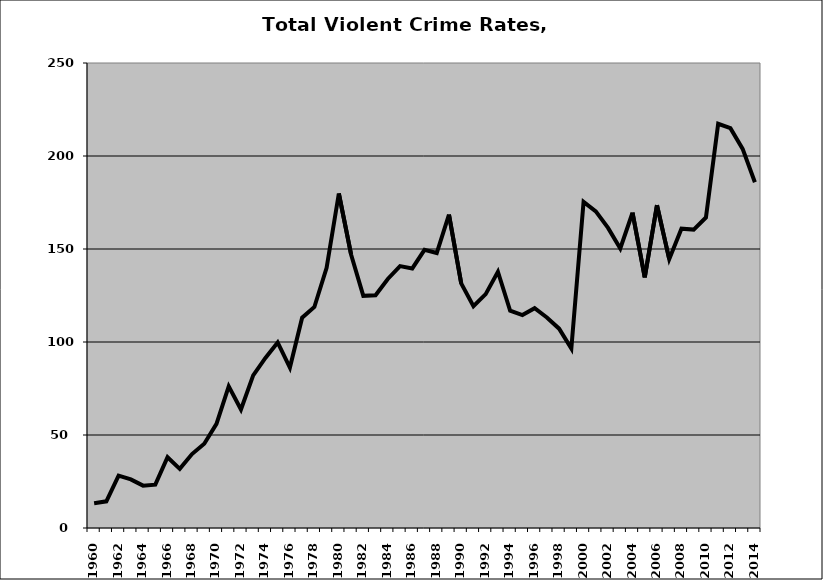
| Category | VCR |
|---|---|
| 1960.0 | 13.346 |
| 1961.0 | 14.332 |
| 1962.0 | 28.165 |
| 1963.0 | 26.156 |
| 1964.0 | 22.783 |
| 1965.0 | 23.318 |
| 1966.0 | 38.032 |
| 1967.0 | 31.778 |
| 1968.0 | 39.744 |
| 1969.0 | 45.328 |
| 1970.0 | 55.986 |
| 1971.0 | 76.115 |
| 1972.0 | 63.684 |
| 1973.0 | 82.048 |
| 1974.0 | 91.46 |
| 1975.0 | 99.756 |
| 1976.0 | 86.253 |
| 1977.0 | 113.074 |
| 1978.0 | 118.829 |
| 1979.0 | 139.91 |
| 1980.0 | 179.847 |
| 1981.0 | 147.059 |
| 1982.0 | 124.816 |
| 1983.0 | 125.13 |
| 1984.0 | 133.879 |
| 1985.0 | 140.782 |
| 1986.0 | 139.533 |
| 1987.0 | 149.574 |
| 1988.0 | 147.858 |
| 1989.0 | 168.473 |
| 1990.0 | 131.53 |
| 1991.0 | 119.276 |
| 1992.0 | 125.743 |
| 1993.0 | 137.778 |
| 1994.0 | 116.799 |
| 1995.0 | 114.46 |
| 1996.0 | 118.158 |
| 1997.0 | 113.214 |
| 1998.0 | 107.173 |
| 1999.0 | 96.492 |
| 2000.0 | 175.354 |
| 2001.0 | 170.245 |
| 2002.0 | 161.33 |
| 2003.0 | 150.306 |
| 2004.0 | 169.493 |
| 2005.0 | 134.755 |
| 2006.0 | 173.55 |
| 2007.0 | 144.548 |
| 2008.0 | 160.908 |
| 2009.0 | 160.429 |
| 2010.0 | 166.962 |
| 2011.0 | 217.331 |
| 2012.0 | 214.964 |
| 2013.0 | 203.838 |
| 2014.0 | 185.859 |